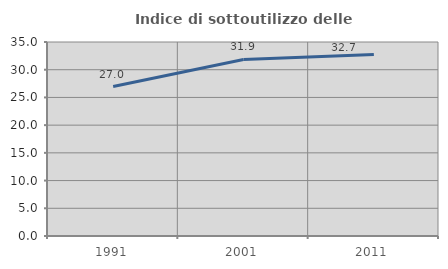
| Category | Indice di sottoutilizzo delle abitazioni  |
|---|---|
| 1991.0 | 26.96 |
| 2001.0 | 31.858 |
| 2011.0 | 32.743 |